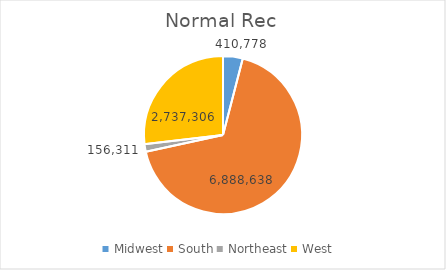
| Category | Series 0 |
|---|---|
| Midwest | 410778.255 |
| South | 6888637.56 |
| Northeast | 156311.125 |
| West | 2737306.055 |